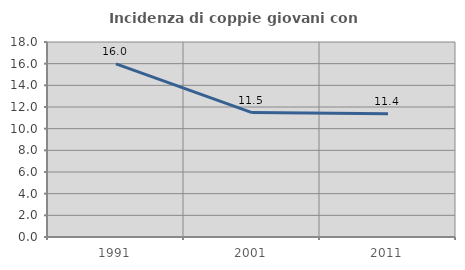
| Category | Incidenza di coppie giovani con figli |
|---|---|
| 1991.0 | 15.978 |
| 2001.0 | 11.482 |
| 2011.0 | 11.383 |